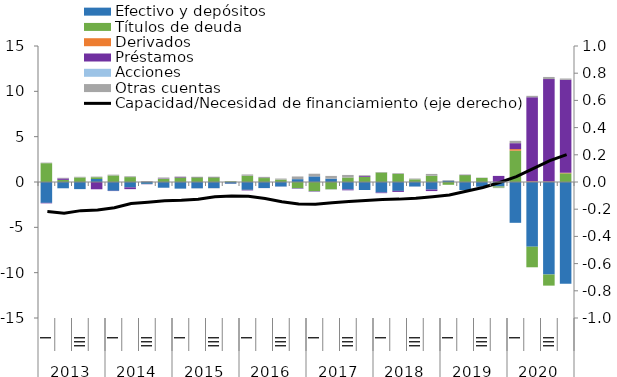
| Category | Efectivo y depósitos | Títulos de deuda | Derivados | Préstamos  | Acciones  | Otras cuentas |
|---|---|---|---|---|---|---|
| 0 | -2.3 | 2.075 | 0 | -0.055 | -0.001 | 0.063 |
| 1 | -0.693 | 0.234 | 0 | 0.162 | 0 | 0.069 |
| 2 | -0.785 | 0.501 | 0 | 0 | -0.001 | 0.075 |
| 3 | 0.329 | 0.197 | 0 | -0.802 | -0.001 | 0.072 |
| 4 | -0.971 | 0.723 | 0 | -0.028 | 0 | 0.087 |
| 5 | -0.59 | 0.541 | 0 | -0.198 | 0 | 0.089 |
| 6 | -0.21 | -0.015 | 0 | -0.024 | -0.001 | 0.101 |
| 7 | -0.633 | 0.347 | 0 | 0.048 | -0.004 | 0.104 |
| 8 | -0.732 | 0.498 | 0 | 0.069 | -0.006 | 0.036 |
| 9 | -0.7 | 0.516 | -0.004 | 0.029 | -0.004 | 0.037 |
| 10 | -0.686 | 0.514 | -0.006 | 0.03 | -0.003 | 0.043 |
| 11 | -0.19 | 0.075 | -0.005 | -0.009 | 0 | 0.026 |
| 12 | -0.866 | 0.69 | -0.008 | -0.055 | -0.008 | 0.141 |
| 13 | -0.663 | 0.436 | -0.003 | -0.005 | -0.016 | 0.13 |
| 14 | -0.501 | 0.267 | 0.002 | -0.009 | -0.017 | 0.112 |
| 15 | 0.314 | -0.699 | 0.002 | -0.05 | -0.024 | 0.295 |
| 16 | 0.619 | -1.012 | 0.007 | -0.049 | -0.014 | 0.287 |
| 17 | 0.373 | -0.808 | 0.005 | -0.008 | -0.008 | 0.292 |
| 18 | -0.825 | 0.494 | 0.002 | -0.091 | -0.006 | 0.282 |
| 19 | -0.882 | 0.573 | 0.001 | 0.09 | 0 | 0.083 |
| 20 | -1.163 | 1.051 | 0 | -0.067 | 0 | 0.051 |
| 21 | -0.98 | 0.882 | 0 | -0.111 | 0 | 0.083 |
| 22 | -0.5 | 0.293 | 0 | -0.004 | 0 | 0.09 |
| 23 | -0.837 | 0.686 | 0.001 | -0.163 | 0 | 0.204 |
| 24 | 0.147 | -0.307 | 0 | 0.002 | 0 | 0.063 |
| 25 | -0.893 | 0.759 | 0 | 0.033 | 0 | 0.033 |
| 26 | -0.519 | 0.448 | 0 | -0.006 | 0 | 0.036 |
| 27 | -0.488 | -0.135 | 0 | 0.671 | 0 | -0.052 |
| 28 | -4.502 | 3.456 | 0.172 | 0.655 | 0 | 0.258 |
| 29 | -7.138 | -2.268 | 0.073 | 9.276 | 0 | 0.155 |
| 30 | -10.204 | -1.226 | 0.058 | 11.291 | 0 | 0.237 |
| 31 | -11.214 | 0.959 | 0.06 | 10.254 | 0 | 0.141 |